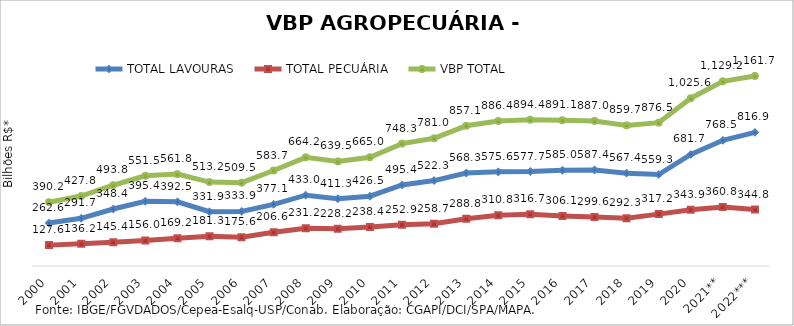
| Category | TOTAL LAVOURAS | TOTAL PECUÁRIA | VBP TOTAL |
|---|---|---|---|
| 2000 | 262.574 | 127.635 | 390.209 |
| 2001 | 291.671 | 136.17 | 427.841 |
| 2002 | 348.411 | 145.362 | 493.774 |
| 2003 | 395.444 | 156.021 | 551.465 |
| 2004 | 392.549 | 169.238 | 561.787 |
| 2005 | 331.882 | 181.295 | 513.178 |
| 2006 | 333.91 | 175.587 | 509.496 |
| 2007 | 377.09 | 206.568 | 583.658 |
| 2008 | 432.993 | 231.199 | 664.192 |
| 2009 | 411.286 | 228.192 | 639.478 |
| 2010 | 426.549 | 238.416 | 664.965 |
| 2011 | 495.384 | 252.898 | 748.282 |
| 2012 | 522.322 | 258.7 | 781.022 |
| 2013 | 568.29 | 288.807 | 857.097 |
| 2014 | 575.602 | 310.839 | 886.44 |
| 2015 | 577.69 | 316.66 | 894.35 |
| 2016 | 584.995 | 306.131 | 891.126 |
| 2017 | 587.424 | 299.553 | 886.977 |
| 2018 | 567.419 | 292.308 | 859.727 |
| 2019 | 559.259 | 317.239 | 876.497 |
| 2020 | 681.749 | 343.866 | 1025.616 |
| 2021** | 768.454 | 360.761 | 1129.215 |
| 2022*** | 816.938 | 344.756 | 1161.694 |